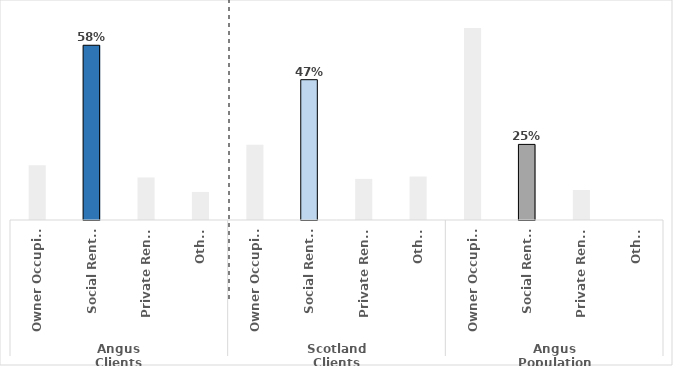
| Category | Series 0 |
|---|---|
| 0 | 0.182 |
| 1 | 0.582 |
| 2 | 0.142 |
| 3 | 0.094 |
| 4 | 0.25 |
| 5 | 0.468 |
| 6 | 0.137 |
| 7 | 0.145 |
| 8 | 0.64 |
| 9 | 0.252 |
| 10 | 0.1 |
| 11 | 0 |